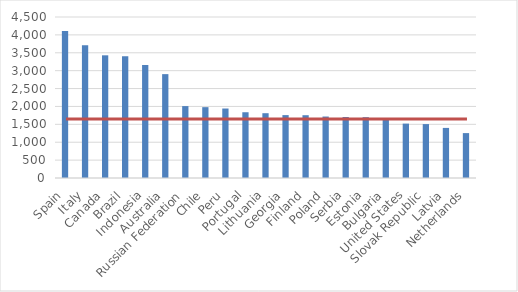
| Category | Series 0 |
|---|---|
| Spain | 4108 |
| Italy | 3707 |
| Canada | 3429 |
| Brazil | 3403 |
| Indonesia | 3159 |
| Australia | 2903 |
| Russian Federation | 2010 |
| Chile | 1980 |
| Peru | 1942 |
| Portugal | 1838 |
| Lithuania | 1811 |
| Georgia | 1758 |
| Finland | 1755 |
| Poland | 1718 |
| Serbia | 1705 |
| Estonia | 1700 |
| Bulgaria | 1655 |
| United States | 1520 |
| Slovak Republic | 1507 |
| Latvia | 1400 |
| Netherlands | 1255 |